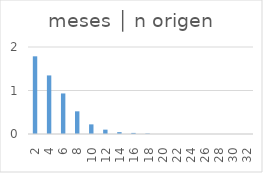
| Category | meses │ n origen |
|---|---|
| 2.0 | 1.786 |
| 4.0 | 1.346 |
| 6.0 | 0.932 |
| 8.0 | 0.521 |
| 10.0 | 0.221 |
| 12.0 | 0.1 |
| 14.0 | 0.043 |
| 16.0 | 0.025 |
| 18.0 | 0.011 |
| 20.0 | 0 |
| 22.0 | 0 |
| 24.0 | 0 |
| 26.0 | 0 |
| 28.0 | 0 |
| 30.0 | 0 |
| 32.0 | 0 |